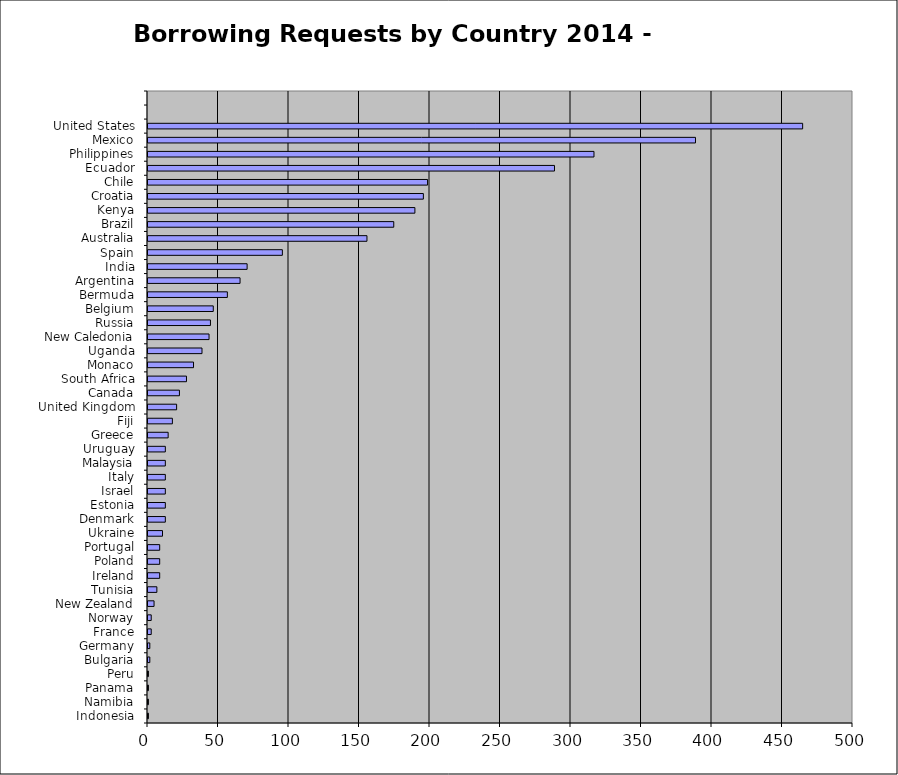
| Category | Series 0 |
|---|---|
| Indonesia | 1 |
| Namibia | 1 |
| Panama | 1 |
| Peru | 1 |
| Bulgaria | 2 |
| Germany | 2 |
| France | 3 |
| Norway | 3 |
| New Zealand | 5 |
| Tunisia | 7 |
| Ireland | 9 |
| Poland | 9 |
| Portugal | 9 |
| Ukraine | 11 |
| Denmark | 13 |
| Estonia | 13 |
| Israel | 13 |
| Italy | 13 |
| Malaysia | 13 |
| Uruguay | 13 |
| Greece | 15 |
| Fiji | 18 |
| United Kingdom | 21 |
| Canada | 23 |
| South Africa | 28 |
| Monaco | 33 |
| Uganda | 39 |
| New Caledonia | 44 |
| Russia | 45 |
| Belgium | 47 |
| Bermuda | 57 |
| Argentina | 66 |
| India | 71 |
| Spain | 96 |
| Australia | 156 |
| Brazil | 175 |
| Kenya | 190 |
| Croatia | 196 |
| Chile | 199 |
| Ecuador | 289 |
| Philippines | 317 |
| Mexico | 389 |
| United States | 465 |